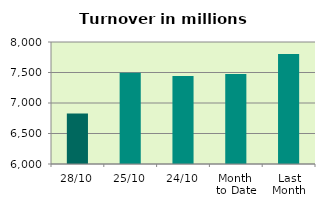
| Category | Series 0 |
|---|---|
| 28/10 | 6829.389 |
| 25/10 | 7497.171 |
| 24/10 | 7442.092 |
| Month 
to Date | 7474.974 |
| Last
Month | 7802.515 |